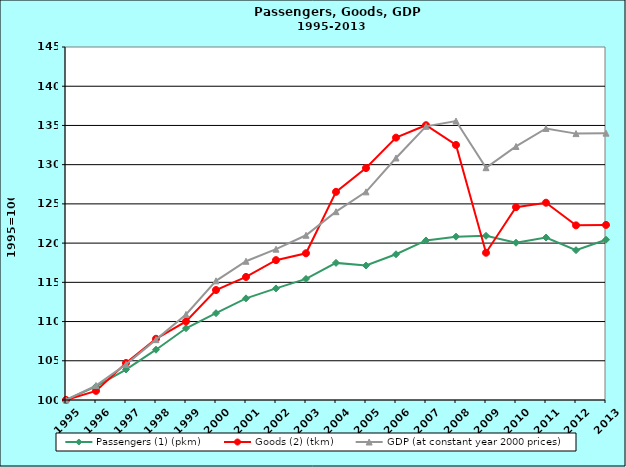
| Category | Passengers (1) (pkm) | Goods (2) (tkm) | GDP (at constant year 2000 prices) |
|---|---|---|---|
| 1995.0 | 100 | 100 | 100 |
| 1996.0 | 101.736 | 101.165 | 101.838 |
| 1997.0 | 103.884 | 104.716 | 104.539 |
| 1998.0 | 106.412 | 107.807 | 107.695 |
| 1999.0 | 109.147 | 110.017 | 110.911 |
| 2000.0 | 111.069 | 114.019 | 115.193 |
| 2001.0 | 112.957 | 115.683 | 117.688 |
| 2002.0 | 114.224 | 117.828 | 119.228 |
| 2003.0 | 115.436 | 118.703 | 121 |
| 2004.0 | 117.479 | 126.536 | 124.007 |
| 2005.0 | 117.138 | 129.565 | 126.534 |
| 2006.0 | 118.579 | 133.446 | 130.852 |
| 2007.0 | 120.338 | 135.028 | 134.889 |
| 2008.0 | 120.819 | 132.513 | 135.569 |
| 2009.0 | 120.933 | 118.774 | 129.611 |
| 2010.0 | 120.048 | 124.584 | 132.323 |
| 2011.0 | 120.71 | 125.151 | 134.618 |
| 2012.0 | 119.098 | 122.263 | 133.958 |
| 2013.0 | 120.429 | 122.32 | 134.018 |